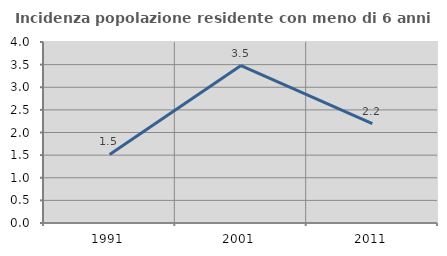
| Category | Incidenza popolazione residente con meno di 6 anni |
|---|---|
| 1991.0 | 1.515 |
| 2001.0 | 3.478 |
| 2011.0 | 2.198 |